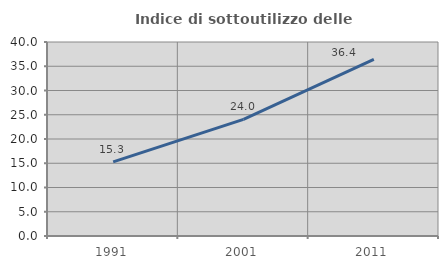
| Category | Indice di sottoutilizzo delle abitazioni  |
|---|---|
| 1991.0 | 15.282 |
| 2001.0 | 24.047 |
| 2011.0 | 36.402 |